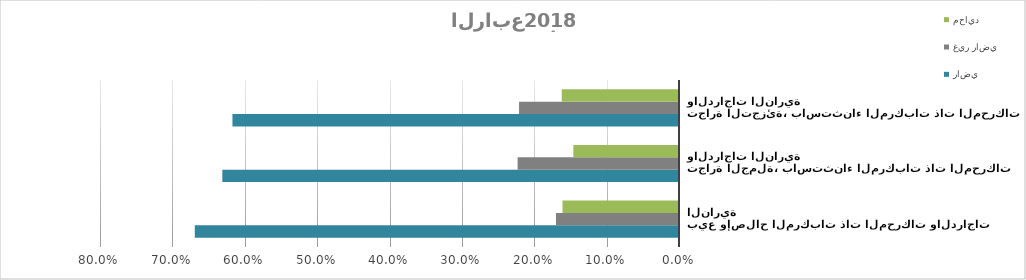
| Category | راضي  | غير راضي | محايد |
|---|---|---|---|
| بيع وإصلاح المركبات ذات المحركات والدراجات النارية | 0.669 | 0.17 | 0.161 |
| تجارة الجملة، باستثناء المركبات ذات المحركات والدراجات النارية | 0.631 | 0.223 | 0.146 |
| تجارة التجزئة، باستثناء المركبات ذات المحركات والدراجات النارية | 0.617 | 0.221 | 0.162 |